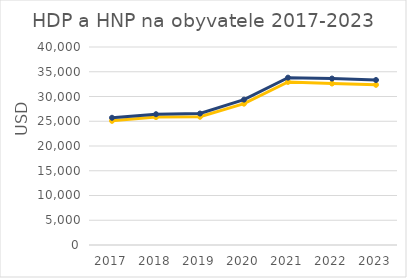
| Category | HDP/obv. (USD) | HNP/obv. (USD) |
|---|---|---|
| 2017.0 | 25080 | 25704 |
| 2018.0 | 25838 | 26421 |
| 2019.0 | 25908 | 26561 |
| 2020.0 | 28549 | 29369 |
| 2021.0 | 32944 | 33808 |
| 2022.0 | 32625 | 33624 |
| 2023.0 | 32358 | 33329 |